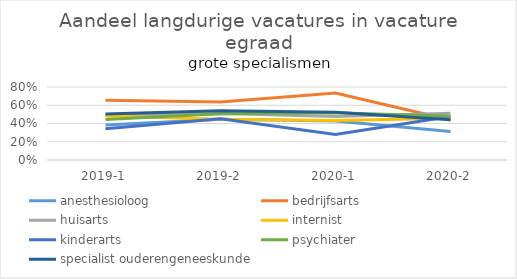
| Category | anesthesioloog | bedrijfsarts | huisarts | internist | kinderarts | psychiater | specialist ouderengeneeskunde |
|---|---|---|---|---|---|---|---|
| 2019-1 | 0.382 | 0.654 | 0.488 | 0.481 | 0.343 | 0.444 | 0.505 |
| 2019-2 | 0.445 | 0.635 | 0.511 | 0.447 | 0.452 | 0.507 | 0.539 |
| 2020-1 | 0.429 | 0.735 | 0.476 | 0.434 | 0.279 | 0.518 | 0.524 |
| 2020-2 | 0.312 | 0.439 | 0.513 | 0.458 | 0.476 | 0.478 | 0.441 |